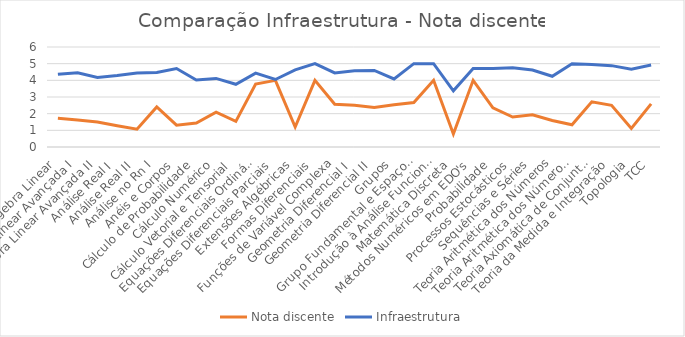
| Category | Nota discente | Infraestrutura |
|---|---|---|
| Álgebra Linear | 1.72 | 4.362 |
| Álgebra Linear Avançada I | 1.618 | 4.45 |
| Álgebra Linear Avançada II | 1.5 | 4.175 |
| Análise Real I | 1.271 | 4.285 |
| Análise Real II | 1.067 | 4.438 |
| Análise no Rn I | 2.4 | 4.472 |
| Anéis e Corpos | 1.308 | 4.708 |
| Cálculo de Probabilidade | 1.435 | 4.017 |
| Cálculo Numérico | 2.087 | 4.116 |
| Cálculo Vetorial e Tensorial | 1.536 | 3.762 |
| Equações Diferenciais Ordinárias | 3.778 | 4.434 |
| Equações Diferenciais Parciais | 4 | 4.05 |
| Extensões Algébricas | 1.2 | 4.625 |
| Formas Diferenciais | 4 | 5 |
| Funções de Variável Complexa | 2.562 | 4.442 |
| Geometria Diferencial I | 2.5 | 4.575 |
| Geometria Diferencial II | 2.375 | 4.594 |
| Grupos | 2.529 | 4.083 |
| Grupo Fundamental e Espaço de Recobrimento | 2.667 | 5 |
| Introdução à Análise Funcional | 4 | 5 |
| Matemática Discreta | 0.78 | 3.373 |
| Métodos Numéricos em EDO's | 4 | 4.708 |
| Probabilidade | 2.353 | 4.707 |
| Processos Estocásticos | 1.8 | 4.75 |
| Sequências e Séries | 1.933 | 4.618 |
| Teoria Aritmética dos Números | 1.593 | 4.245 |
| Teoria Aritmética dos Números II | 1.333 | 5 |
| Teoria Axiomática de Conjuntos | 2.714 | 4.95 |
| Teoria da Medida e Integração | 2.5 | 4.882 |
| Topologia | 1.111 | 4.673 |
| TCC | 2.587 | 4.917 |